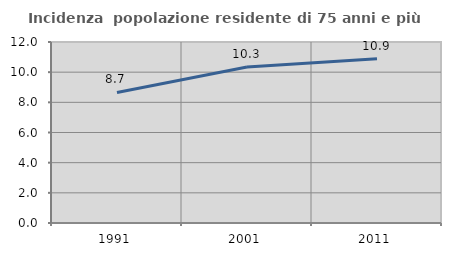
| Category | Incidenza  popolazione residente di 75 anni e più |
|---|---|
| 1991.0 | 8.656 |
| 2001.0 | 10.343 |
| 2011.0 | 10.889 |